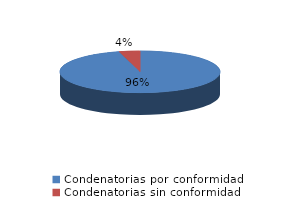
| Category | Series 0 |
|---|---|
| 0 | 497 |
| 1 | 22 |